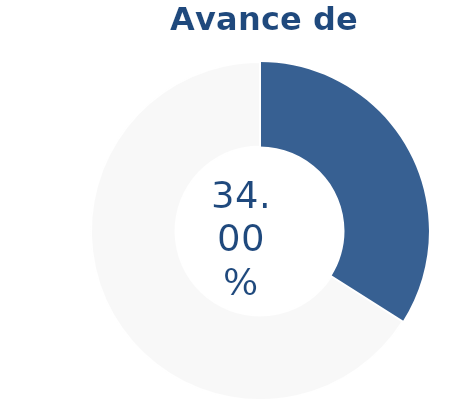
| Category | Series 0 |
|---|---|
| Acumulado 1 Trimestre | 0.34 |
| Año | -0.66 |